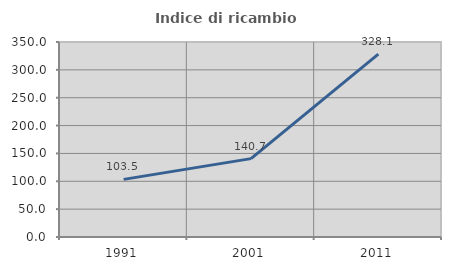
| Category | Indice di ricambio occupazionale  |
|---|---|
| 1991.0 | 103.458 |
| 2001.0 | 140.657 |
| 2011.0 | 328.125 |